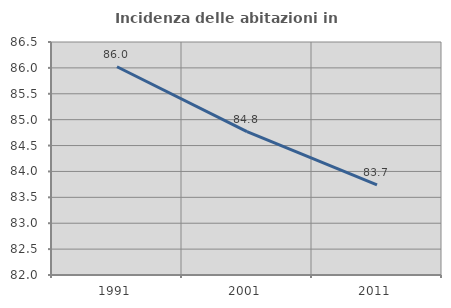
| Category | Incidenza delle abitazioni in proprietà  |
|---|---|
| 1991.0 | 86.022 |
| 2001.0 | 84.768 |
| 2011.0 | 83.742 |